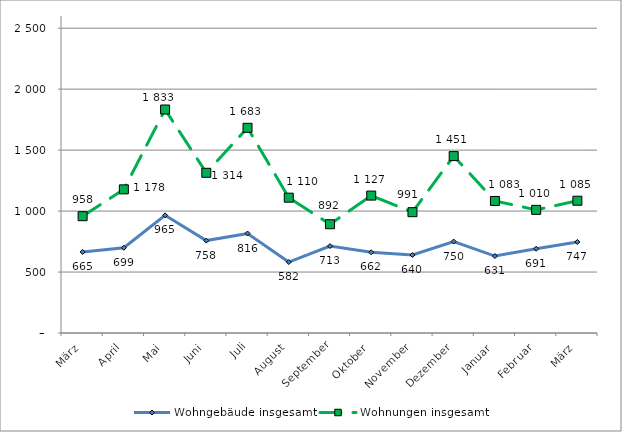
| Category | Wohngebäude insgesamt | Wohnungen insgesamt |
|---|---|---|
| März | 665 | 958 |
| April | 699 | 1178 |
| Mai | 965 | 1833 |
| Juni | 758 | 1314 |
| Juli | 816 | 1683 |
| August | 582 | 1110 |
| September | 713 | 892 |
| Oktober | 662 | 1127 |
| November | 640 | 991 |
| Dezember | 750 | 1451 |
| Januar | 631 | 1083 |
| Februar | 691 | 1010 |
| März | 747 | 1085 |